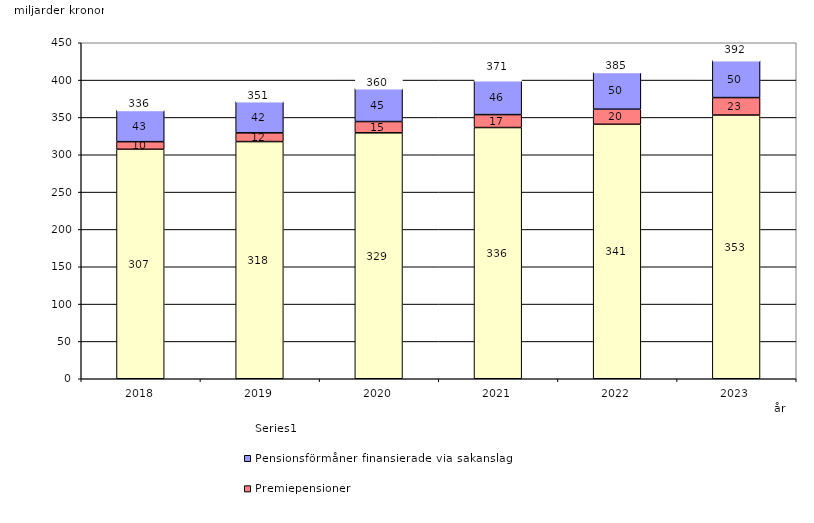
| Category | Inkomstpension och tilläggspension m.m. | Premiepensioner | Pensionsförmåner finansierade via sakanslag | Series 0 |
|---|---|---|---|---|
| 2018.0 | 307.356 | 10.141 | 42.55 | 20 |
| 2019.0 | 317.628 | 11.715 | 42.22 | 20 |
| 2020.0 | 329.386 | 15.067 | 44.526 | 20 |
| 2021.0 | 336.441 | 17.3 | 45.966 | 20 |
| 2022.0 | 340.826 | 20.208 | 49.676 | 20 |
| 2023.0 | 353.183 | 23.378 | 49.899 | 20 |